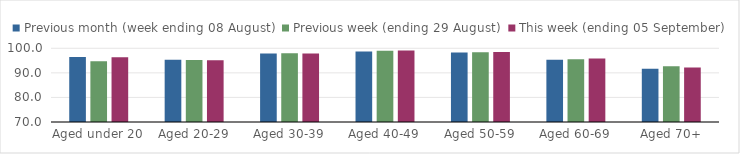
| Category | Previous month (week ending 08 August) | Previous week (ending 29 August) | This week (ending 05 September) |
|---|---|---|---|
| Aged under 20 | 96.49 | 94.71 | 96.35 |
| Aged 20-29 | 95.35 | 95.28 | 95.09 |
| Aged 30-39 | 97.87 | 98.02 | 97.84 |
| Aged 40-49 | 98.73 | 99.03 | 99.07 |
| Aged 50-59 | 98.32 | 98.39 | 98.51 |
| Aged 60-69 | 95.31 | 95.56 | 95.82 |
| Aged 70+ | 91.7 | 92.65 | 92.21 |